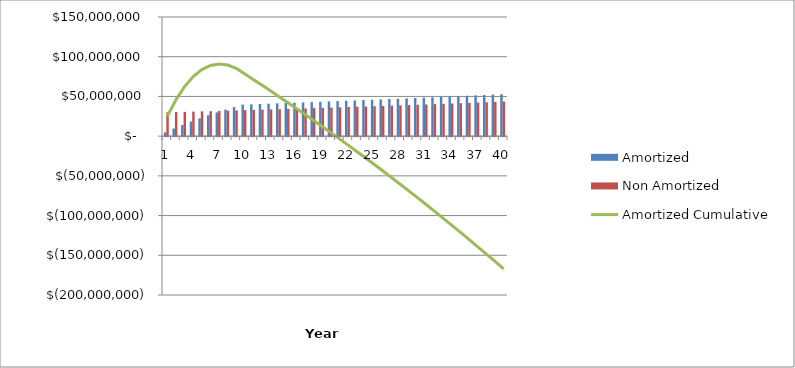
| Category | Amortized | Non Amortized |
|---|---|---|
| 0 | 4890000 | 30000000 |
| 1 | 9568695.382 | 30286319.4 |
| 2 | 14038844.601 | 30575371.427 |
| 3 | 18303161.645 | 30867182.16 |
| 4 | 22364316.564 | 31161777.929 |
| 5 | 26224935.988 | 31459185.315 |
| 6 | 29887603.636 | 31759431.15 |
| 7 | 33354860.82 | 32062542.526 |
| 8 | 36629206.948 | 32368546.79 |
| 9 | 39713100.006 | 32677471.554 |
| 10 | 40092121.038 | 32989344.688 |
| 11 | 40474759.439 | 33304194.334 |
| 12 | 40861049.734 | 33622048.899 |
| 13 | 41251026.776 | 33942937.061 |
| 14 | 41644725.75 | 34266887.774 |
| 15 | 42042182.18 | 34593930.265 |
| 16 | 42443431.926 | 34924094.044 |
| 17 | 42848511.191 | 35257408.899 |
| 18 | 43257456.525 | 35593904.904 |
| 19 | 43670304.825 | 35933612.421 |
| 20 | 44087093.341 | 36276562.099 |
| 21 | 44507859.678 | 36622784.882 |
| 22 | 44932641.8 | 36972312.009 |
| 23 | 45361478.035 | 37325175.015 |
| 24 | 45794407.074 | 37681405.739 |
| 25 | 46231467.979 | 38041036.322 |
| 26 | 46672700.185 | 38404099.212 |
| 27 | 47118143.502 | 38770627.166 |
| 28 | 47567838.121 | 39140653.257 |
| 29 | 48021824.617 | 39514210.868 |
| 30 | 48480143.951 | 39891333.707 |
| 31 | 48942837.475 | 40272055.798 |
| 32 | 49409946.937 | 40656411.493 |
| 33 | 49881514.483 | 41044435.471 |
| 34 | 50357582.659 | 41436162.742 |
| 35 | 50838194.421 | 41831628.651 |
| 36 | 51323393.132 | 42230868.878 |
| 37 | 51813222.569 | 42633919.446 |
| 38 | 52307726.929 | 43040816.72 |
| 39 | 52806950.829 | 43451597.414 |